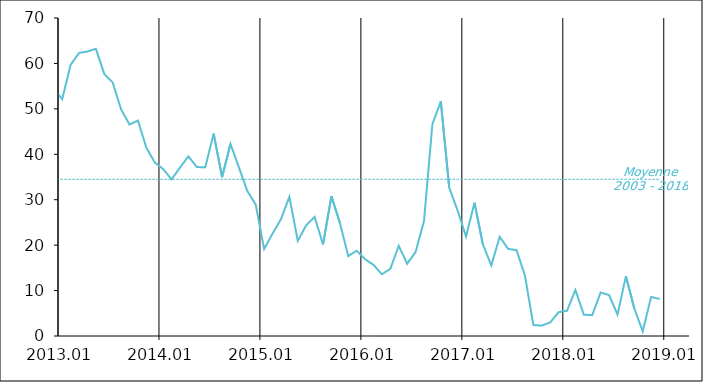
| Category | Series 1 | Moyenne
2003 - 2018 |
|---|---|---|
| 2003-01-20 | 36 | 34.494 |
| 2003-02-20 | 49 | 34.494 |
| 2003-03-20 | 48 | 34.494 |
| 2003-04-20 | 44 | 34.494 |
| 2003-05-20 | 45 | 34.494 |
| 2003-06-20 | 46 | 34.494 |
| 2003-07-20 | 43 | 34.494 |
| 2003-08-20 | 45 | 34.494 |
| 2003-09-20 | 40 | 34.494 |
| 2003-10-20 | 49 | 34.494 |
| 2003-11-20 | 38 | 34.494 |
| 2003-12-20 | 38 | 34.494 |
| 2004-01-20 | 39 | 34.494 |
| 2004-02-20 | 42 | 34.494 |
| 2004-03-20 | 40 | 34.494 |
| 2004-04-20 | 43 | 34.494 |
| 2004-05-20 | 41 | 34.494 |
| 2004-06-20 | 39 | 34.494 |
| 2004-07-20 | 35 | 34.494 |
| 2004-08-20 | 38 | 34.494 |
| 2004-09-20 | 44 | 34.494 |
| 2004-10-20 | 42 | 34.494 |
| 2004-11-20 | 43 | 34.494 |
| 2004-12-20 | 37 | 34.494 |
| 2005-01-20 | 45 | 34.494 |
| 2005-02-20 | 38 | 34.494 |
| 2005-03-20 | 40 | 34.494 |
| 2005-04-20 | 42 | 34.494 |
| 2005-05-20 | 47 | 34.494 |
| 2005-06-20 | 44 | 34.494 |
| 2005-07-20 | 48 | 34.494 |
| 2005-08-20 | 46 | 34.494 |
| 2005-09-20 | 41 | 34.494 |
| 2005-10-20 | 38 | 34.494 |
| 2005-11-20 | 40 | 34.494 |
| 2005-12-20 | 32 | 34.494 |
| 2006-01-20 | 37 | 34.494 |
| 2006-02-20 | 37 | 34.494 |
| 2006-03-20 | 42 | 34.494 |
| 2006-04-20 | 37 | 34.494 |
| 2006-05-20 | 34 | 34.494 |
| 2006-06-20 | 31 | 34.494 |
| 2006-07-20 | 31 | 34.494 |
| 2006-08-20 | 26 | 34.494 |
| 2006-09-20 | 29 | 34.494 |
| 2006-10-20 | 22 | 34.494 |
| 2006-11-20 | 23 | 34.494 |
| 2006-12-20 | 49 | 34.494 |
| 2007-01-20 | 37 | 34.494 |
| 2007-02-20 | 26 | 34.494 |
| 2007-03-20 | 25 | 34.494 |
| 2007-04-20 | 20 | 34.494 |
| 2007-05-20 | 17 | 34.494 |
| 2007-06-20 | 20 | 34.494 |
| 2007-07-20 | 22 | 34.494 |
| 2007-08-20 | 18 | 34.494 |
| 2007-09-20 | 18 | 34.494 |
| 2007-10-20 | 7 | 34.494 |
| 2007-11-20 | 18 | 34.494 |
| 2007-12-20 | 6 | 34.494 |
| 2008-01-20 | 8 | 34.494 |
| 2008-02-20 | 10 | 34.494 |
| 2008-03-20 | 4 | 34.494 |
| 2008-04-20 | 13 | 34.494 |
| 2008-05-20 | 12 | 34.494 |
| 2008-06-20 | 17 | 34.494 |
| 2008-07-20 | 17 | 34.494 |
| 2008-08-20 | 24 | 34.494 |
| 2008-09-20 | 27 | 34.494 |
| 2008-10-20 | 41 | 34.494 |
| 2008-11-20 | 57 | 34.494 |
| 2008-12-20 | 62 | 34.494 |
| 2009-01-20 | 71 | 34.494 |
| 2009-02-20 | 78 | 34.494 |
| 2009-03-20 | 73 | 34.494 |
| 2009-04-20 | 79 | 34.494 |
| 2009-05-20 | 76 | 34.494 |
| 2009-06-20 | 73 | 34.494 |
| 2009-07-20 | 73 | 34.494 |
| 2009-08-20 | 74 | 34.494 |
| 2009-09-20 | 75 | 34.494 |
| 2009-10-20 | 67 | 34.494 |
| 2009-11-20 | 66 | 34.494 |
| 2009-12-20 | 64 | 34.494 |
| 2010-01-20 | 71 | 34.494 |
| 2010-02-20 | 68 | 34.494 |
| 2010-03-20 | 65 | 34.494 |
| 2010-04-20 | 53 | 34.494 |
| 2010-05-20 | 46 | 34.494 |
| 2010-06-20 | 43 | 34.494 |
| 2010-07-20 | 37 | 34.494 |
| 2010-08-20 | 36 | 34.494 |
| 2010-09-20 | 39 | 34.494 |
| 2010-10-20 | 38 | 34.494 |
| 2010-11-20 | 31 | 34.494 |
| 2010-12-20 | 25 | 34.494 |
| 2011-01-20 | 29 | 34.494 |
| 2011-02-20 | 22 | 34.494 |
| 2011-03-20 | 17 | 34.494 |
| 2011-04-20 | 17 | 34.494 |
| 2011-05-20 | 14 | 34.494 |
| 2011-06-20 | 24 | 34.494 |
| 2011-07-20 | 22 | 34.494 |
| 2011-08-20 | 25 | 34.494 |
| 2011-09-20 | 35 | 34.494 |
| 2011-10-20 | 31 | 34.494 |
| 2011-11-20 | 50 | 34.494 |
| 2011-12-20 | 31 | 34.494 |
| 2012-01-20 | 36 | 34.494 |
| 2012-02-20 | 42 | 34.494 |
| 2012-03-20 | 35 | 34.494 |
| 2012-04-20 | 44 | 34.494 |
| 2012-05-20 | 40 | 34.494 |
| 2012-06-20 | 38 | 34.494 |
| 2012-07-20 | 40 | 34.494 |
| 2012-08-20 | 50 | 34.494 |
| 2012-09-20 | 46 | 34.494 |
| 2012-10-20 | 54 | 34.494 |
| 2012-11-20 | 58.447 | 34.494 |
| 2012-12-20 | 54.393 | 34.494 |
| 2013-01-20 | 52.127 | 34.494 |
| 2013-02-20 | 59.702 | 34.494 |
| 2013-03-20 | 62.306 | 34.494 |
| 2013-04-20 | 62.628 | 34.494 |
| 2013-05-20 | 63.233 | 34.494 |
| 2013-06-20 | 57.689 | 34.494 |
| 2013-07-20 | 55.803 | 34.494 |
| 2013-08-20 | 49.883 | 34.494 |
| 2013-09-20 | 46.548 | 34.494 |
| 2013-10-20 | 47.425 | 34.494 |
| 2013-11-20 | 41.46 | 34.494 |
| 2013-12-20 | 38.207 | 34.494 |
| 2014-01-20 | 36.747 | 34.494 |
| 2014-02-20 | 34.477 | 34.494 |
| 2014-03-20 | 37.079 | 34.494 |
| 2014-04-20 | 39.536 | 34.494 |
| 2014-05-20 | 37.194 | 34.494 |
| 2014-06-20 | 37.122 | 34.494 |
| 2014-07-20 | 44.549 | 34.494 |
| 2014-08-20 | 34.97 | 34.494 |
| 2014-09-20 | 42.287 | 34.494 |
| 2014-10-20 | 37.125 | 34.494 |
| 2014-11-20 | 31.938 | 34.494 |
| 2014-12-20 | 28.931 | 34.494 |
| 2015-01-20 | 19.146 | 34.494 |
| 2015-02-20 | 22.537 | 34.494 |
| 2015-03-20 | 25.725 | 34.494 |
| 2015-04-20 | 30.614 | 34.494 |
| 2015-05-20 | 20.941 | 34.494 |
| 2015-06-20 | 24.376 | 34.494 |
| 2015-07-20 | 26.191 | 34.494 |
| 2015-08-20 | 20.154 | 34.494 |
| 2015-09-20 | 30.781 | 34.494 |
| 2015-10-20 | 24.923 | 34.494 |
| 2015-11-20 | 17.584 | 34.494 |
| 2015-12-20 | 18.769 | 34.494 |
| 2016-01-20 | 16.889 | 34.494 |
| 2016-02-20 | 15.669 | 34.494 |
| 2016-03-20 | 13.583 | 34.494 |
| 2016-04-20 | 14.774 | 34.494 |
| 2016-05-20 | 19.87 | 34.494 |
| 2016-06-20 | 15.923 | 34.494 |
| 2016-07-20 | 18.488 | 34.494 |
| 2016-08-20 | 25.309 | 34.494 |
| 2016-09-20 | 46.606 | 34.494 |
| 2016-10-20 | 51.645 | 34.494 |
| 2016-11-20 | 32.671 | 34.494 |
| 2016-12-20 | 27.611 | 34.494 |
| 2017-01-20 | 21.889 | 34.494 |
| 2017-02-20 | 29.336 | 34.494 |
| 2017-03-20 | 20.162 | 34.494 |
| 2017-04-20 | 15.539 | 34.494 |
| 2017-05-20 | 21.833 | 34.494 |
| 2017-06-20 | 19.177 | 34.494 |
| 2017-07-20 | 18.9 | 34.494 |
| 2017-08-20 | 13.307 | 34.494 |
| 2017-09-20 | 2.409 | 34.494 |
| 2017-10-20 | 2.297 | 34.494 |
| 2017-11-20 | 2.982 | 34.494 |
| 2017-12-20 | 5.242 | 34.494 |
| 2018-01-20 | 5.55 | 34.494 |
| 2018-02-20 | 10.137 | 34.494 |
| 2018-03-20 | 4.671 | 34.494 |
| 2018-04-20 | 4.616 | 34.494 |
| 2018-05-20 | 9.574 | 34.494 |
| 2018-06-20 | 9.008 | 34.494 |
| 2018-07-20 | 4.711 | 34.494 |
| 2018-08-20 | 13.141 | 34.494 |
| 2018-09-20 | 6.059 | 34.494 |
| 2018-10-20 | 1.025 | 34.494 |
| 2018-11-20 | 8.619 | 34.494 |
| 2018-12-20 | 8.151 | 34.494 |